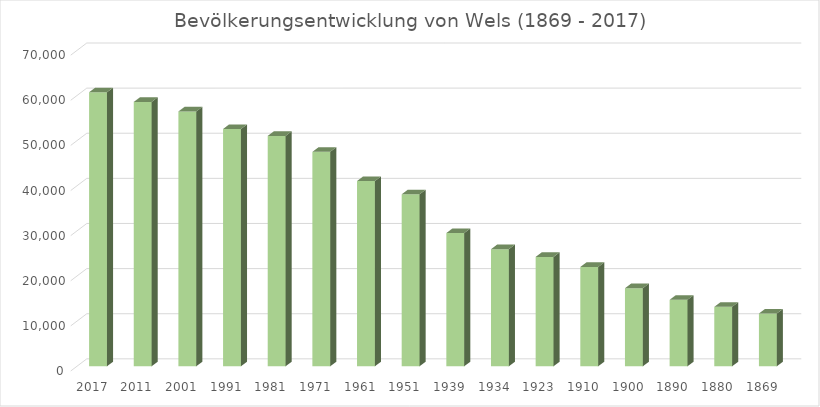
| Category | Series 0 |
|---|---|
| 2017.0 | 60739 |
| 2011.0 | 58591 |
| 2001.0 | 56478 |
| 1991.0 | 52594 |
| 1981.0 | 51060 |
| 1971.0 | 47527 |
| 1961.0 | 41060 |
| 1951.0 | 38120 |
| 1939.0 | 29533 |
| 1934.0 | 25956 |
| 1923.0 | 24248 |
| 1910.0 | 22015 |
| 1900.0 | 17308 |
| 1890.0 | 14735 |
| 1880.0 | 13175 |
| 1869.0 | 11704 |